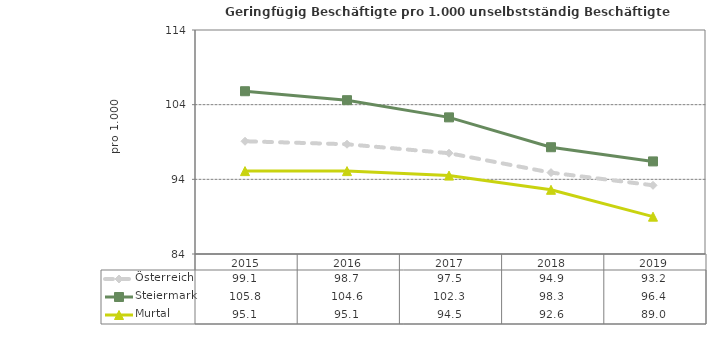
| Category | Österreich | Steiermark | Murtal |
|---|---|---|---|
| 2019.0 | 93.2 | 96.4 | 89 |
| 2018.0 | 94.9 | 98.3 | 92.6 |
| 2017.0 | 97.5 | 102.3 | 94.5 |
| 2016.0 | 98.7 | 104.6 | 95.1 |
| 2015.0 | 99.1 | 105.8 | 95.1 |